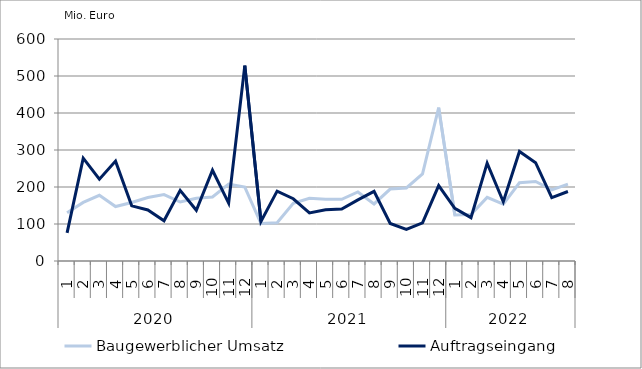
| Category | Baugewerblicher Umsatz | Auftragseingang |
|---|---|---|
| 0 | 130445.562 | 75891.481 |
| 1 | 158433.655 | 277923.85 |
| 2 | 177529.832 | 220973.626 |
| 3 | 147259.799 | 269936.091 |
| 4 | 157965.891 | 149072.895 |
| 5 | 171647.778 | 137984.76 |
| 6 | 179530.732 | 108645.965 |
| 7 | 159480.457 | 190771.468 |
| 8 | 169638.111 | 136988.906 |
| 9 | 173040.053 | 245341.603 |
| 10 | 207619.085 | 156647.224 |
| 11 | 199947.086 | 528166.004 |
| 12 | 101295.895 | 106850.127 |
| 13 | 103236.543 | 188883.434 |
| 14 | 156172.725 | 168204.42 |
| 15 | 169257.088 | 130052.073 |
| 16 | 166897.821 | 138492.214 |
| 17 | 166720.216 | 140262.426 |
| 18 | 186515.191 | 165331.191 |
| 19 | 154188.941 | 188169.655 |
| 20 | 194464.12 | 101359.538 |
| 21 | 197281.201 | 85626.862 |
| 22 | 235325.083 | 102880.924 |
| 23 | 414469.471 | 203900.676 |
| 24 | 124217.549 | 142351.759 |
| 25 | 125619.696 | 117194.423 |
| 26 | 171896.664 | 264509.013 |
| 27 | 153384.654 | 160146.519 |
| 28 | 211335.38 | 295997.826 |
| 29 | 214914.164 | 265813.917 |
| 30 | 192047.613 | 171529.517 |
| 31 | 207577.681 | 187809.656 |